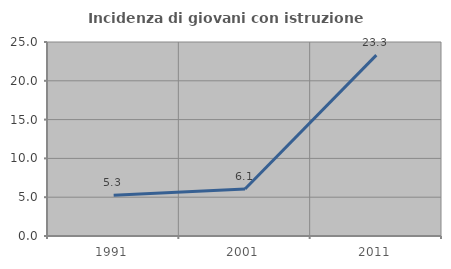
| Category | Incidenza di giovani con istruzione universitaria |
|---|---|
| 1991.0 | 5.263 |
| 2001.0 | 6.061 |
| 2011.0 | 23.308 |